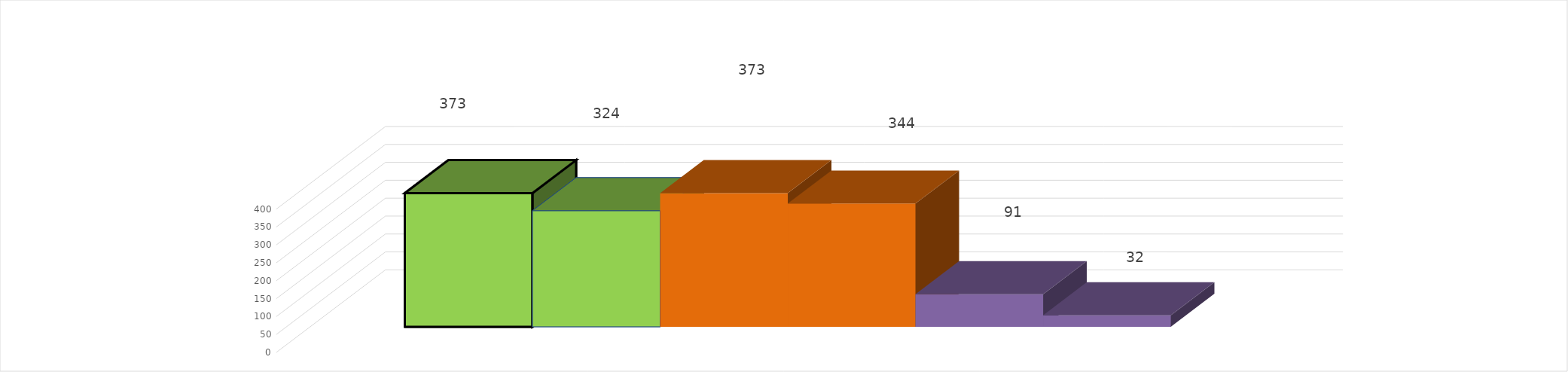
| Category | 1 квартал 2018 год | 1 квартал 2019 год |
|---|---|---|
| 0 | 91 | 32 |